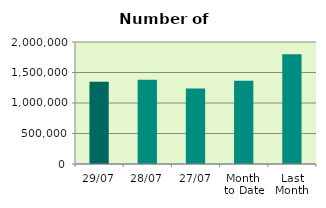
| Category | Series 0 |
|---|---|
| 29/07 | 1347430 |
| 28/07 | 1381878 |
| 27/07 | 1237348 |
| Month 
to Date | 1365170.571 |
| Last
Month | 1799892.818 |